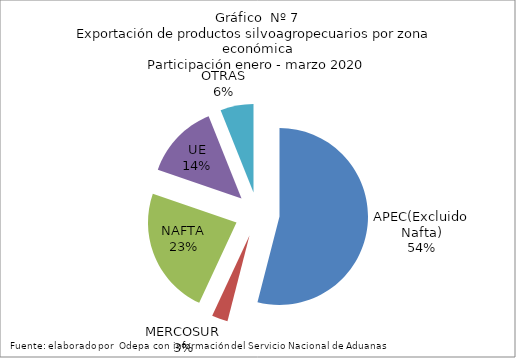
| Category | Series 0 |
|---|---|
| APEC(Excluido Nafta) | 1697792.416 |
| MERCOSUR | 91707.138 |
| NAFTA | 734122.018 |
| UE | 429701.789 |
| OTRAS | 190351.639 |